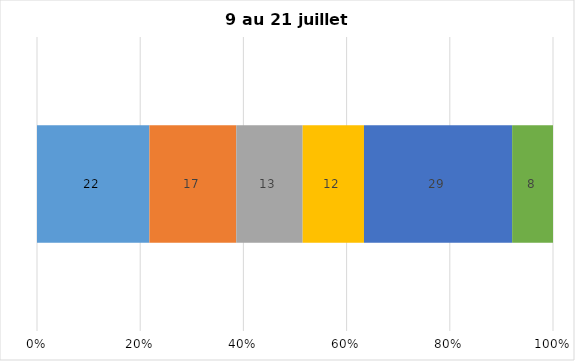
| Category | Plusieurs fois par jour | Une fois par jour | Quelques fois par semaine   | Une fois par semaine ou moins   |  Jamais   |  Je n’utilise pas les médias sociaux |
|---|---|---|---|---|---|---|
| 0 | 22 | 17 | 13 | 12 | 29 | 8 |